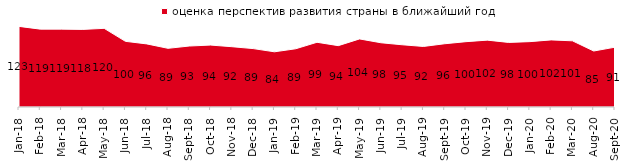
| Category | оценка перспектив развития страны в ближайший год |
|---|---|
| 2018-01-01 | 122.9 |
| 2018-02-01 | 118.7 |
| 2018-03-01 | 118.7 |
| 2018-04-01 | 118.3 |
| 2018-05-01 | 119.9 |
| 2018-06-01 | 100.1 |
| 2018-07-01 | 96.2 |
| 2018-08-01 | 89.45 |
| 2018-09-01 | 92.95 |
| 2018-10-01 | 94.4 |
| 2018-11-01 | 91.916 |
| 2018-12-01 | 89.05 |
| 2019-01-01 | 84.15 |
| 2019-02-01 | 88.75 |
| 2019-03-01 | 98.657 |
| 2019-04-01 | 93.515 |
| 2019-05-01 | 103.764 |
| 2019-06-01 | 97.955 |
| 2019-07-01 | 94.851 |
| 2019-08-01 | 92.308 |
| 2019-09-01 | 96.436 |
| 2019-10-01 | 99.604 |
| 2019-11-01 | 101.931 |
| 2019-12-01 | 98.465 |
| 2020-01-01 | 99.653 |
| 2020-02-01 | 102.277 |
| 2020-03-01 | 100.892 |
| 2020-08-01 | 85.353 |
| 2020-09-01 | 91.19 |